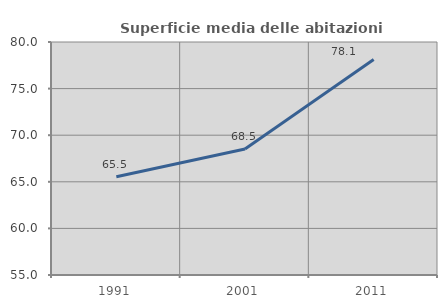
| Category | Superficie media delle abitazioni occupate |
|---|---|
| 1991.0 | 65.543 |
| 2001.0 | 68.519 |
| 2011.0 | 78.116 |